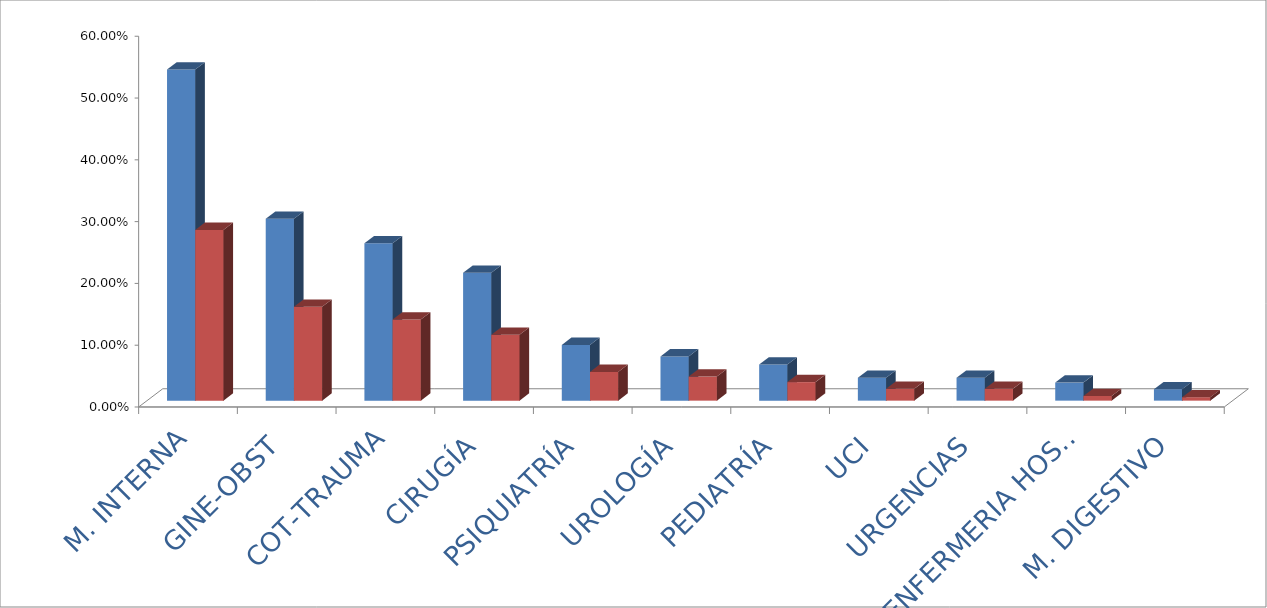
| Category | Series 0 | Series 1 |
|---|---|---|
| M. INTERNA | 0.536 | 0.276 |
| GINE-OBST | 0.294 | 0.152 |
| COT-TRAUMA | 0.255 | 0.131 |
| CIRUGÍA | 0.207 | 0.107 |
| PSIQUIATRÍA | 0.09 | 0.046 |
| UROLOGÍA  | 0.072 | 0.039 |
| PEDIATRÍA | 0.058 | 0.03 |
| UCI | 0.037 | 0.019 |
| URGENCIAS | 0.037 | 0.019 |
| ENFERMERIA HOSPITALIZACIÓN | 0.029 | 0.008 |
| M. DIGESTIVO | 0.019 | 0.006 |